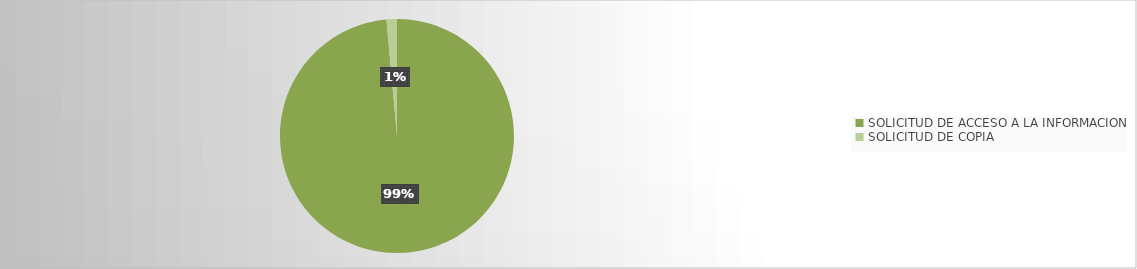
| Category | Series 0 |
|---|---|
| SOLICITUD DE ACCESO A LA INFORMACION | 137 |
| SOLICITUD DE COPIA | 2 |